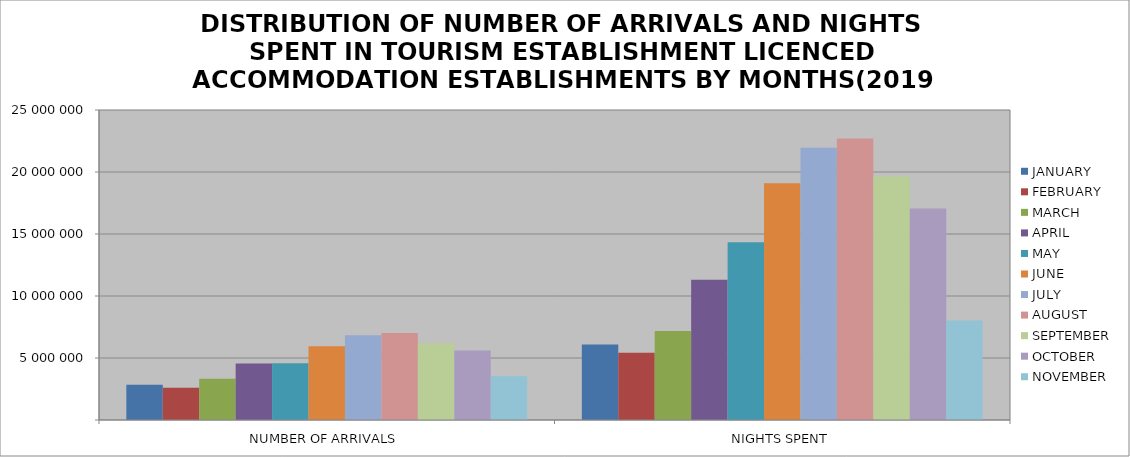
| Category | JANUARY | FEBRUARY | MARCH | APRIL | MAY | JUNE | JULY | AUGUST | SEPTEMBER | OCTOBER | NOVEMBER |
|---|---|---|---|---|---|---|---|---|---|---|---|
| NUMBER OF ARRIVALS | 2833509 | 2607189 | 3326719 | 4561709 | 4585981 | 5949977 | 6830740 | 7020795 | 6189605 | 5614434 | 3537887 |
| NIGHTS SPENT | 6098050 | 5425989 | 7182593 | 11302946 | 14338328 | 19092571 | 21955256 | 22706728 | 19635859 | 17054807 | 8015568 |